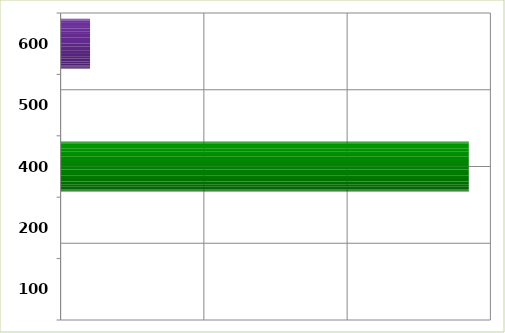
| Category | Series 0 |
|---|---|
| 100.0 | 0 |
| 200.0 | 0 |
| 400.0 | 2849258.4 |
| 500.0 | 0 |
| 600.0 | 205600 |